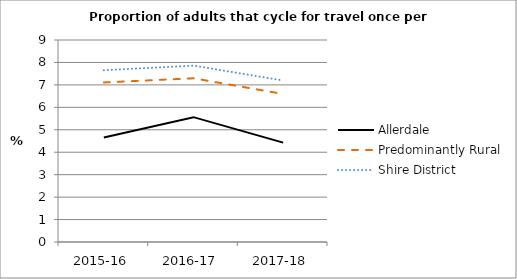
| Category | Allerdale | Predominantly Rural | Shire District |
|---|---|---|---|
| 2015-16 | 4.655 | 7.109 | 7.652 |
| 2016-17 | 5.562 | 7.294 | 7.859 |
| 2017-18 | 4.427 | 6.595 | 7.195 |